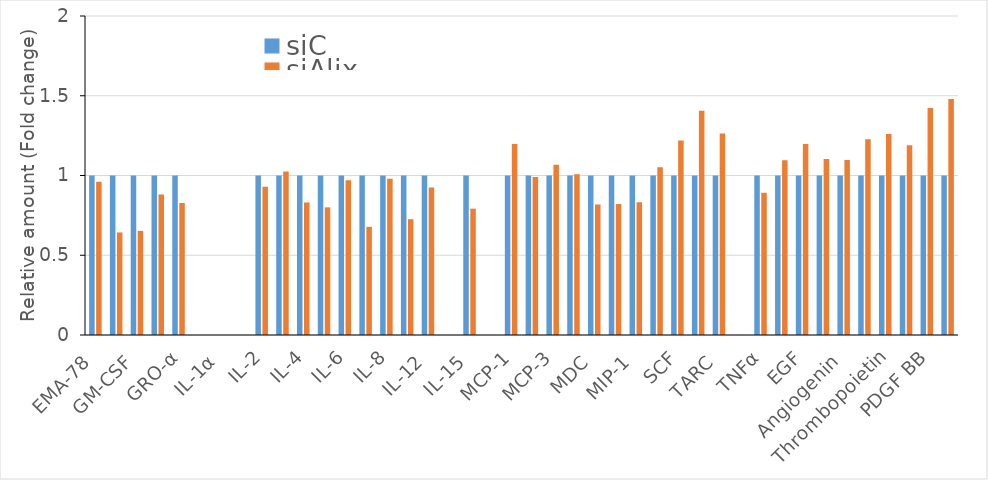
| Category | siC | siAlix |
|---|---|---|
| EMA-78 | 1 | 0.962 |
| GCSF | 1 | 0.643 |
| GM-CSF | 1 | 0.653 |
| GRO | 1 | 0.881 |
| GRO-α | 1 | 0.827 |
| I-309 | 0 | 0 |
| IL-1α | 0 | 0 |
| IL-1β | 0 | 0 |
| IL-2 | 1 | 0.93 |
| IL-3 | 1 | 1.025 |
| IL-4 | 1 | 0.83 |
| IL-5 | 1 | 0.8 |
| IL-6 | 1 | 0.97 |
| IL-7 | 1 | 0.678 |
| IL-8 | 1 | 0.979 |
| IL-10 | 1 | 0.726 |
| IL-12 | 1 | 0.925 |
| IL-13 | 0 | 0 |
| IL-15 | 1 | 0.792 |
| IFNγ | 0 | 0 |
| MCP-1 | 1 | 1.198 |
| MCP-2 | 1 | 0.991 |
| MCP-3 | 1 | 1.067 |
| MCSF | 1 | 1.007 |
| MDC | 1 | 0.818 |
| MIG | 1 | 0.821 |
| MIP-1 | 1 | 0.832 |
| RANTES | 1 | 1.052 |
| SCF | 1 | 1.22 |
| SDF-1 | 1 | 1.406 |
| TARC | 1 | 1.263 |
| TGFβ1 | 0 | 0 |
| TNFα | 1 | 0.892 |
| TNFβ | 1 | 1.095 |
| EGF | 1 | 1.197 |
| IGF-1 | 1 | 1.104 |
| Angiogenin | 1 | 1.097 |
| Oncostatin M | 1 | 1.228 |
| Thrombopoietin | 1 | 1.26 |
| VEGF | 1 | 1.189 |
| PDGF BB | 1 | 1.423 |
| Leptin | 1 | 1.48 |